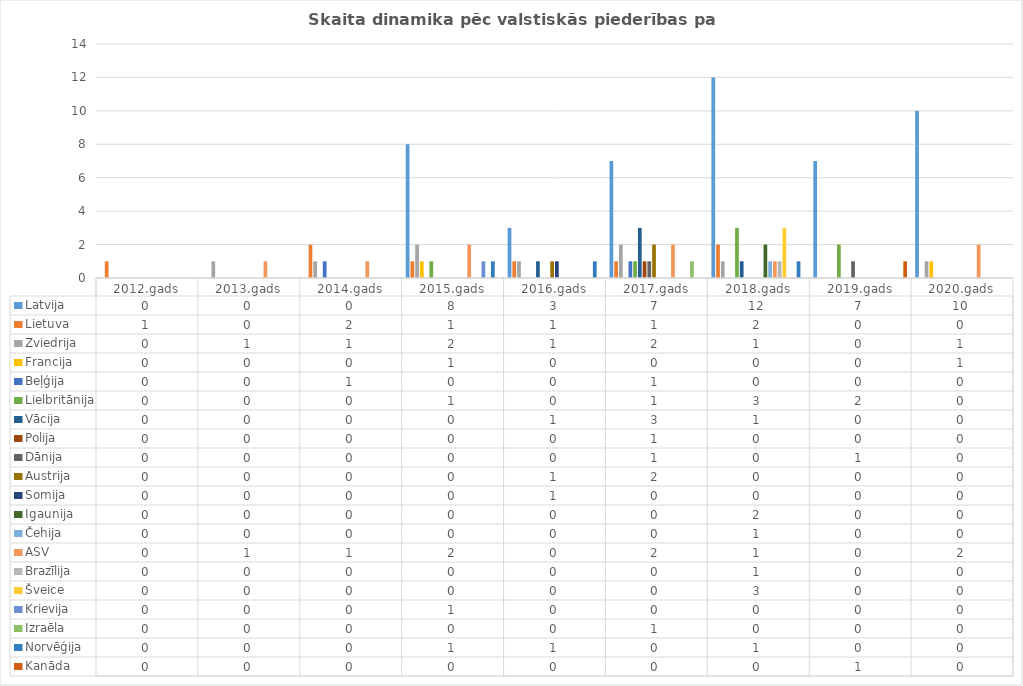
| Category | Latvija | Lietuva | Zviedrija | Francija | Beļģija | Lielbritānija | Vācija | Polija | Dānija | Austrija | Somija | Igaunija | Čehija | ASV | Brazīlija | Šveice | Krievija | Izraēla | Norvēģija | Kanāda |
|---|---|---|---|---|---|---|---|---|---|---|---|---|---|---|---|---|---|---|---|---|
| 2012.gads | 0 | 1 | 0 | 0 | 0 | 0 | 0 | 0 | 0 | 0 | 0 | 0 | 0 | 0 | 0 | 0 | 0 | 0 | 0 | 0 |
| 2013.gads | 0 | 0 | 1 | 0 | 0 | 0 | 0 | 0 | 0 | 0 | 0 | 0 | 0 | 1 | 0 | 0 | 0 | 0 | 0 | 0 |
| 2014.gads | 0 | 2 | 1 | 0 | 1 | 0 | 0 | 0 | 0 | 0 | 0 | 0 | 0 | 1 | 0 | 0 | 0 | 0 | 0 | 0 |
| 2015.gads | 8 | 1 | 2 | 1 | 0 | 1 | 0 | 0 | 0 | 0 | 0 | 0 | 0 | 2 | 0 | 0 | 1 | 0 | 1 | 0 |
| 2016.gads | 3 | 1 | 1 | 0 | 0 | 0 | 1 | 0 | 0 | 1 | 1 | 0 | 0 | 0 | 0 | 0 | 0 | 0 | 1 | 0 |
| 2017.gads | 7 | 1 | 2 | 0 | 1 | 1 | 3 | 1 | 1 | 2 | 0 | 0 | 0 | 2 | 0 | 0 | 0 | 1 | 0 | 0 |
| 2018.gads | 12 | 2 | 1 | 0 | 0 | 3 | 1 | 0 | 0 | 0 | 0 | 2 | 1 | 1 | 1 | 3 | 0 | 0 | 1 | 0 |
| 2019.gads | 7 | 0 | 0 | 0 | 0 | 2 | 0 | 0 | 1 | 0 | 0 | 0 | 0 | 0 | 0 | 0 | 0 | 0 | 0 | 1 |
| 2020.gads | 10 | 0 | 1 | 1 | 0 | 0 | 0 | 0 | 0 | 0 | 0 | 0 | 0 | 2 | 0 | 0 | 0 | 0 | 0 | 0 |